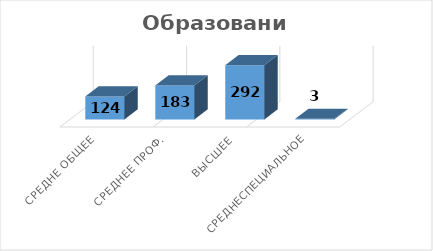
| Category | колическтво |
|---|---|
| Средне общее | 124 |
| Среднее проф. | 183 |
| Высшее | 292 |
| Среднеспециальное | 3 |